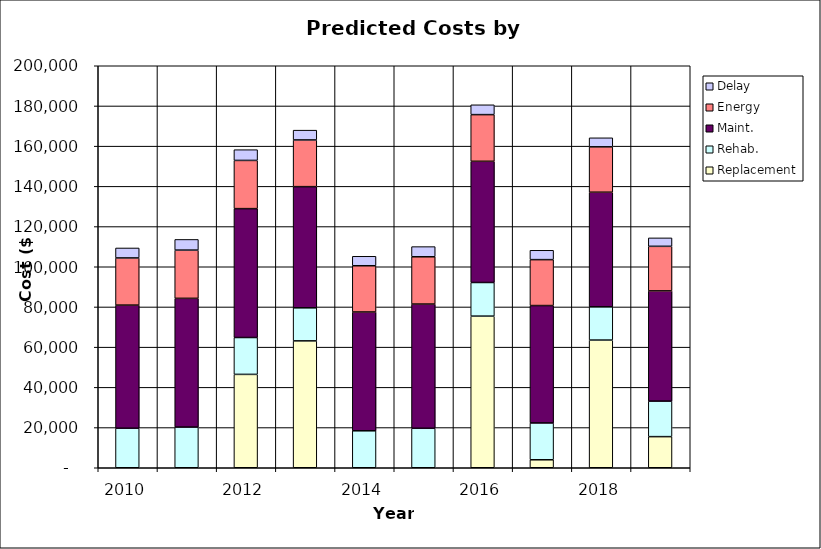
| Category | Replacement | Rehab. | Maint. | Energy | Delay |
|---|---|---|---|---|---|
| 2010.0 | 0 | 19667.18 | 61249.646 | 23471.828 | 4955.47 |
| 2011.0 | 0 | 20238.936 | 64043.039 | 23998.549 | 5315.215 |
| 2012.0 | 46449 | 18347.587 | 64116.822 | 23990.21 | 5340.473 |
| 2013.0 | 63123 | 16447.071 | 60284.682 | 23236.297 | 4868.252 |
| 2014.0 | 0 | 18385.659 | 59102.272 | 23010.198 | 4717.863 |
| 2015.0 | 0 | 19639.641 | 61797.731 | 23526.559 | 5060.359 |
| 2016.0 | 75430 | 16736.13 | 60304.574 | 23217.783 | 4888.569 |
| 2017.0 | 3970 | 18317.707 | 58407.095 | 22846.71 | 4654.91 |
| 2018.0 | 63520 | 16534.55 | 57032.515 | 22581.4 | 4483.227 |
| 2019.0 | 15483 | 17666.55 | 54843.881 | 22172.597 | 4198.869 |